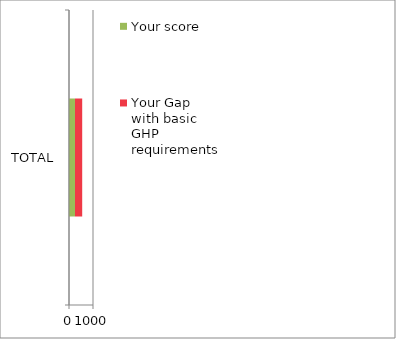
| Category | Your score | Your Gap with basic GHP requirements |
|---|---|---|
| TOTAL | 250 | 300 |